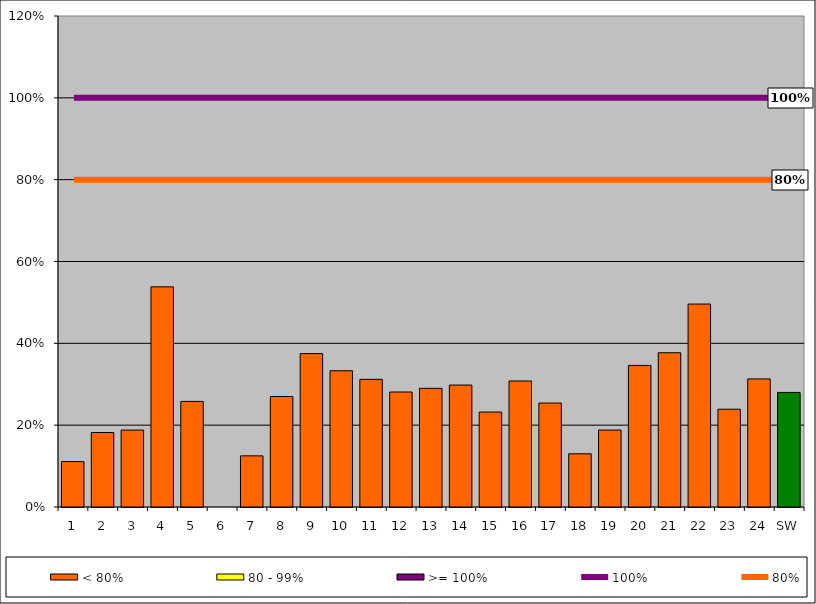
| Category | < 80% | 80 - 99% | >= 100% |
|---|---|---|---|
| 1 | 0.111 | 0 | 0 |
| 2 | 0.182 | 0 | 0 |
| 3 | 0.188 | 0 | 0 |
| 4 | 0.538 | 0 | 0 |
| 5 | 0.258 | 0 | 0 |
| 6 | 0 | 0 | 0 |
| 7 | 0.125 | 0 | 0 |
| 8 | 0.27 | 0 | 0 |
| 9 | 0.375 | 0 | 0 |
| 10 | 0.333 | 0 | 0 |
| 11 | 0.312 | 0 | 0 |
| 12 | 0.281 | 0 | 0 |
| 13 | 0.29 | 0 | 0 |
| 14 | 0.298 | 0 | 0 |
| 15 | 0.232 | 0 | 0 |
| 16 | 0.308 | 0 | 0 |
| 17 | 0.254 | 0 | 0 |
| 18 | 0.13 | 0 | 0 |
| 19 | 0.188 | 0 | 0 |
| 20 | 0.346 | 0 | 0 |
| 21 | 0.377 | 0 | 0 |
| 22 | 0.496 | 0 | 0 |
| 23 | 0.239 | 0 | 0 |
| 24 | 0.313 | 0 | 0 |
| SW | 0.28 | 0 | 0 |